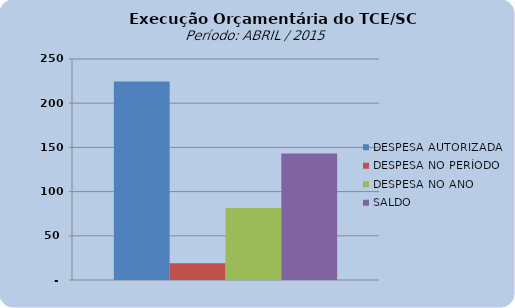
| Category | DESPESA AUTORIZADA | DESPESA NO PERÍODO | DESPESA NO ANO | SALDO |
|---|---|---|---|---|
| 0 | 224686790.48 | 18906835.56 | 81457545.85 | 143229244.63 |